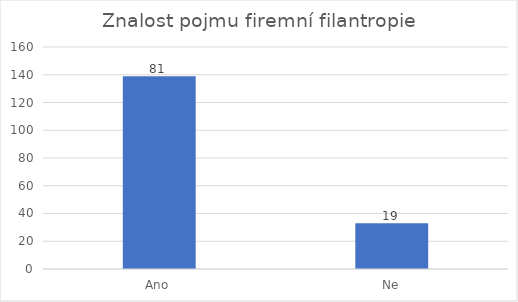
| Category | Počet respondentů |
|---|---|
| Ano | 139 |
| Ne | 33 |